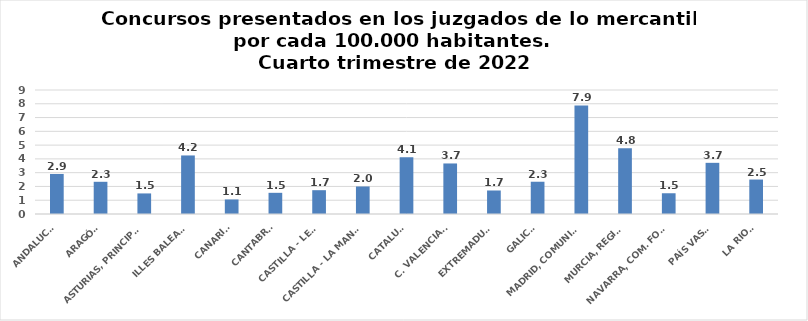
| Category | Series 0 |
|---|---|
| ANDALUCÍA | 2.907 |
| ARAGÓN | 2.337 |
| ASTURIAS, PRINCIPADO | 1.493 |
| ILLES BALEARS | 4.249 |
| CANARIAS | 1.056 |
| CANTABRIA | 1.537 |
| CASTILLA - LEÓN | 1.728 |
| CASTILLA - LA MANCHA | 1.997 |
| CATALUÑA | 4.119 |
| C. VALENCIANA | 3.668 |
| EXTREMADURA | 1.707 |
| GALICIA | 2.342 |
| MADRID, COMUNIDAD | 7.881 |
| MURCIA, REGIÓN | 4.765 |
| NAVARRA, COM. FORAL | 1.506 |
| PAÍS VASCO | 3.713 |
| LA RIOJA | 2.501 |